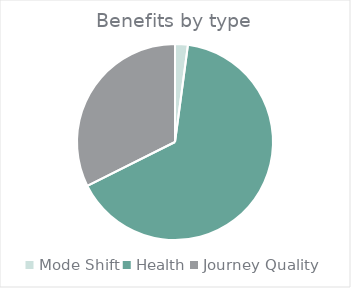
| Category | Series 0 |
|---|---|
| Mode Shift | 265.668 |
| Health | 8251.574 |
| Journey Quality | 4078.254 |